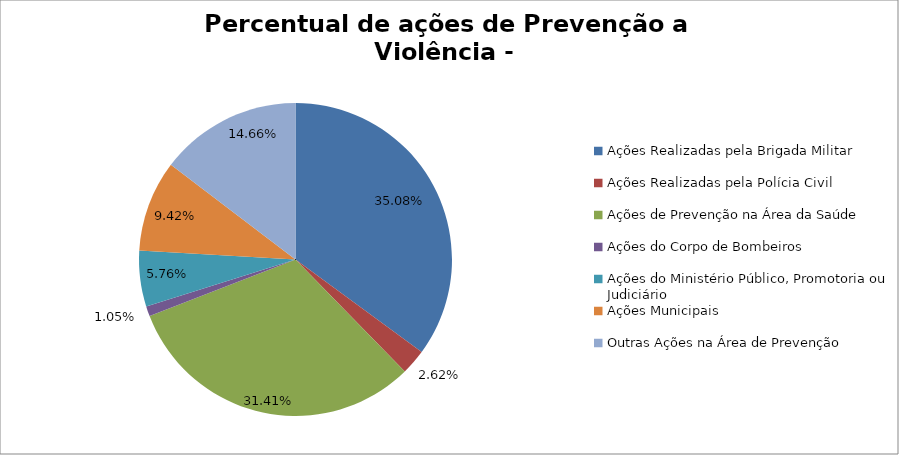
| Category | Percentual |
|---|---|
| Ações Realizadas pela Brigada Militar | 0.351 |
| Ações Realizadas pela Polícia Civil | 0.026 |
| Ações de Prevenção na Área da Saúde | 0.314 |
| Ações do Corpo de Bombeiros | 0.01 |
| Ações do Ministério Público, Promotoria ou Judiciário | 0.058 |
| Ações Municipais | 0.094 |
| Outras Ações na Área de Prevenção | 0.147 |